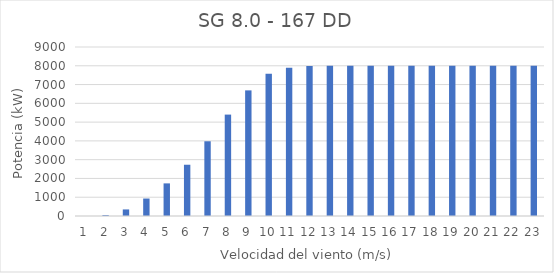
| Category | SG 8.0 - 167 DD |
|---|---|
| 0 | 0 |
| 1 | 48 |
| 2 | 350 |
| 3 | 930 |
| 4 | 1737 |
| 5 | 2730 |
| 6 | 3980 |
| 7 | 5400 |
| 8 | 6690 |
| 9 | 7570 |
| 10 | 7895 |
| 11 | 7990 |
| 12 | 8000 |
| 13 | 8000 |
| 14 | 8000 |
| 15 | 8000 |
| 16 | 8000 |
| 17 | 8000 |
| 18 | 8000 |
| 19 | 8000 |
| 20 | 8000 |
| 21 | 8000 |
| 22 | 8000 |